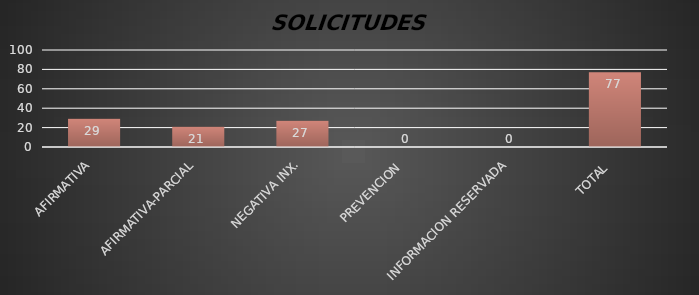
| Category | Series 1 |
|---|---|
| AFIRMATIVA | 29 |
| AFIRMATIVA-PARCIAL | 21 |
| NEGATIVA INX. | 27 |
| PREVENCION  | 0 |
| INFORMACION RESERVADA | 0 |
| TOTAL  | 77 |